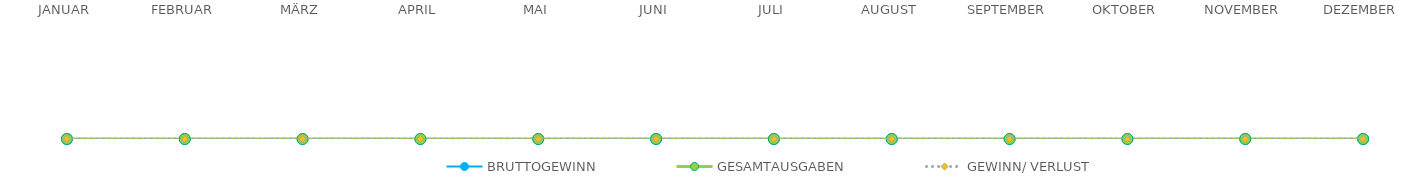
| Category | BRUTTOGEWINN | GESAMTAUSGABEN | GEWINN/ VERLUST |
|---|---|---|---|
| JANUAR | 0 | 0 | 0 |
| FEBRUAR | 0 | 0 | 0 |
| MÄRZ | 0 | 0 | 0 |
| APRIL | 0 | 0 | 0 |
| MAI | 0 | 0 | 0 |
| JUNI | 0 | 0 | 0 |
| JULI | 0 | 0 | 0 |
| AUGUST | 0 | 0 | 0 |
| SEPTEMBER | 0 | 0 | 0 |
| OKTOBER | 0 | 0 | 0 |
| NOVEMBER | 0 | 0 | 0 |
| DEZEMBER | 0 | 0 | 0 |